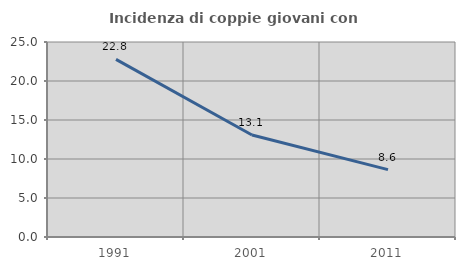
| Category | Incidenza di coppie giovani con figli |
|---|---|
| 1991.0 | 22.778 |
| 2001.0 | 13.072 |
| 2011.0 | 8.64 |